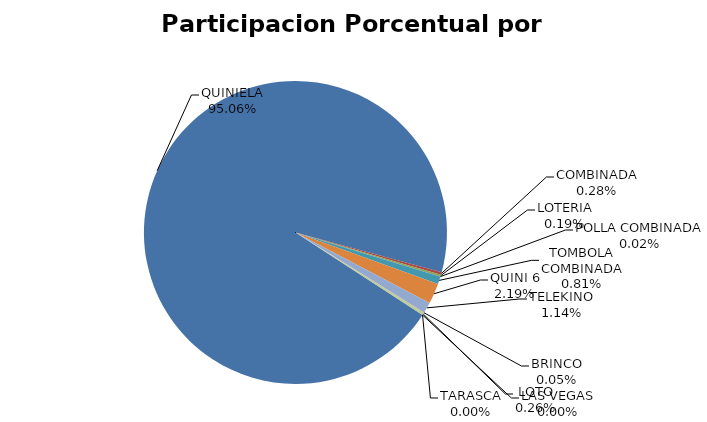
| Category | Series 0 |
|---|---|
| QUINIELA | 83582097.723 |
| COMBINADA | 249398.65 |
| LOTERIA | 167665.45 |
| POLLA COMBINADA | 12474 |
| TOMBOLA COMBINADA | 715896 |
| QUINI 6 | 1924248.27 |
| TELEKINO | 1005734.3 |
| BRINCO | 45505.23 |
| LOTO | 225320 |
| TARASCA | 0 |
| LAS VEGAS | 0 |